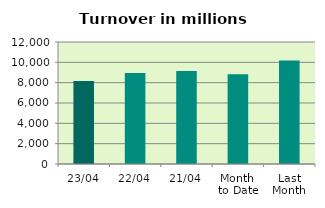
| Category | Series 0 |
|---|---|
| 23/04 | 8161.75 |
| 22/04 | 8944.488 |
| 21/04 | 9149.929 |
| Month 
to Date | 8817.374 |
| Last
Month | 10188.955 |